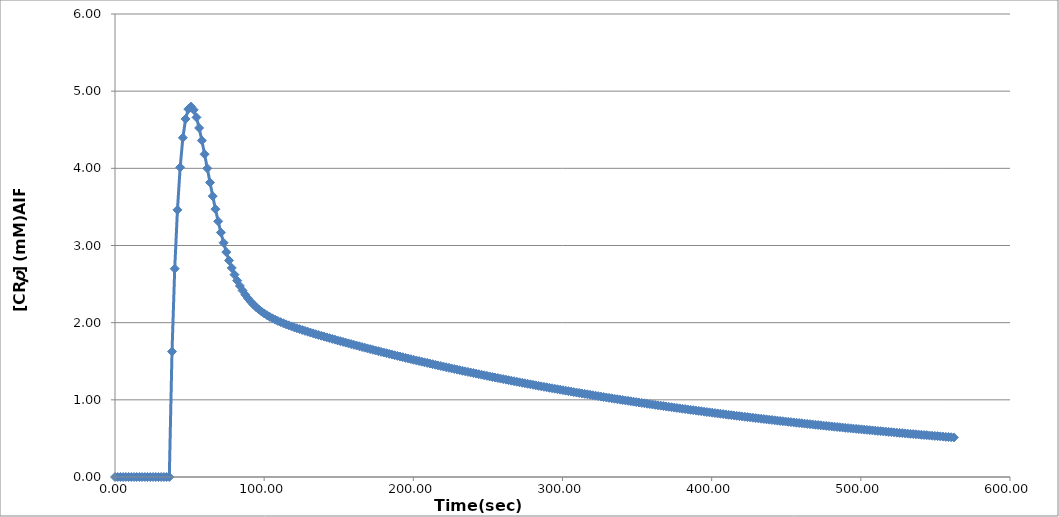
| Category | Series 0 |
|---|---|
| 0.0 | 0 |
| 1.82 | 0 |
| 3.64 | 0 |
| 5.46 | 0 |
| 7.28 | 0 |
| 9.1 | 0 |
| 10.92 | 0 |
| 12.74 | 0 |
| 14.56 | 0 |
| 16.38 | 0 |
| 18.2 | 0 |
| 20.02 | 0 |
| 21.84 | 0 |
| 23.66 | 0 |
| 25.48 | 0 |
| 27.3 | 0 |
| 29.12 | 0 |
| 30.94 | 0 |
| 32.76 | 0 |
| 34.58 | 0 |
| 36.4 | 0 |
| 38.22 | 1.625 |
| 40.04 | 2.699 |
| 41.86 | 3.462 |
| 43.68 | 4.013 |
| 45.5 | 4.396 |
| 47.32 | 4.64 |
| 49.14 | 4.768 |
| 50.96 | 4.8 |
| 52.78 | 4.758 |
| 54.6 | 4.66 |
| 56.42 | 4.523 |
| 58.24 | 4.36 |
| 60.06 | 4.183 |
| 61.88 | 3.999 |
| 63.7 | 3.817 |
| 65.52 | 3.64 |
| 67.34 | 3.471 |
| 69.16 | 3.314 |
| 70.98 | 3.168 |
| 72.8 | 3.035 |
| 74.62 | 2.915 |
| 76.44 | 2.806 |
| 78.26 | 2.709 |
| 80.08 | 2.622 |
| 81.9 | 2.545 |
| 83.72 | 2.476 |
| 85.54 | 2.416 |
| 87.36 | 2.362 |
| 89.18 | 2.314 |
| 91.0 | 2.272 |
| 92.82 | 2.234 |
| 94.64 | 2.2 |
| 96.46 | 2.17 |
| 98.28 | 2.143 |
| 100.1 | 2.118 |
| 101.92 | 2.096 |
| 103.74 | 2.075 |
| 105.56 | 2.056 |
| 107.38 | 2.039 |
| 109.2 | 2.022 |
| 111.02 | 2.007 |
| 112.84 | 1.992 |
| 114.66 | 1.978 |
| 116.48 | 1.965 |
| 118.3 | 1.952 |
| 120.12 | 1.94 |
| 121.94 | 1.928 |
| 123.76 | 1.916 |
| 125.58 | 1.905 |
| 127.4 | 1.894 |
| 129.22 | 1.883 |
| 131.04 | 1.872 |
| 132.86 | 1.861 |
| 134.68 | 1.851 |
| 136.5 | 1.84 |
| 138.32 | 1.83 |
| 140.14 | 1.82 |
| 141.96 | 1.81 |
| 143.78 | 1.8 |
| 145.6 | 1.79 |
| 147.42 | 1.78 |
| 149.24 | 1.77 |
| 151.06 | 1.761 |
| 152.88 | 1.751 |
| 154.7 | 1.741 |
| 156.52 | 1.732 |
| 158.34 | 1.722 |
| 160.16 | 1.713 |
| 161.98 | 1.704 |
| 163.8 | 1.694 |
| 165.62 | 1.685 |
| 167.44 | 1.676 |
| 169.26 | 1.667 |
| 171.08 | 1.658 |
| 172.9 | 1.649 |
| 174.72 | 1.64 |
| 176.54 | 1.631 |
| 178.36 | 1.622 |
| 180.18 | 1.613 |
| 182.0 | 1.604 |
| 183.82 | 1.595 |
| 185.64 | 1.587 |
| 187.46 | 1.578 |
| 189.28 | 1.57 |
| 191.1 | 1.561 |
| 192.92 | 1.553 |
| 194.74 | 1.544 |
| 196.56 | 1.536 |
| 198.38 | 1.527 |
| 200.2 | 1.519 |
| 202.02 | 1.511 |
| 203.84 | 1.502 |
| 205.66 | 1.494 |
| 207.48 | 1.486 |
| 209.3 | 1.478 |
| 211.12 | 1.47 |
| 212.94 | 1.462 |
| 214.76 | 1.454 |
| 216.58 | 1.446 |
| 218.4 | 1.438 |
| 220.22 | 1.43 |
| 222.04 | 1.423 |
| 223.86 | 1.415 |
| 225.68 | 1.407 |
| 227.5 | 1.4 |
| 229.32 | 1.392 |
| 231.14 | 1.384 |
| 232.96 | 1.377 |
| 234.78 | 1.369 |
| 236.6 | 1.362 |
| 238.42 | 1.354 |
| 240.24 | 1.347 |
| 242.06 | 1.34 |
| 243.88 | 1.332 |
| 245.7 | 1.325 |
| 247.52 | 1.318 |
| 249.34 | 1.311 |
| 251.16 | 1.304 |
| 252.98 | 1.297 |
| 254.8 | 1.289 |
| 256.62 | 1.282 |
| 258.44 | 1.275 |
| 260.26 | 1.269 |
| 262.08 | 1.262 |
| 263.9 | 1.255 |
| 265.72 | 1.248 |
| 267.54 | 1.241 |
| 269.36 | 1.234 |
| 271.18 | 1.228 |
| 273.0 | 1.221 |
| 274.82 | 1.214 |
| 276.64 | 1.208 |
| 278.46 | 1.201 |
| 280.28 | 1.195 |
| 282.1 | 1.188 |
| 283.92 | 1.182 |
| 285.74 | 1.175 |
| 287.56 | 1.169 |
| 289.38 | 1.162 |
| 291.2 | 1.156 |
| 293.02 | 1.15 |
| 294.84 | 1.144 |
| 296.66 | 1.137 |
| 298.48 | 1.131 |
| 300.3 | 1.125 |
| 302.12 | 1.119 |
| 303.94 | 1.113 |
| 305.76 | 1.107 |
| 307.58 | 1.101 |
| 309.4 | 1.095 |
| 311.22 | 1.089 |
| 313.04 | 1.083 |
| 314.86 | 1.077 |
| 316.68 | 1.071 |
| 318.5 | 1.065 |
| 320.32 | 1.059 |
| 322.14 | 1.054 |
| 323.96 | 1.048 |
| 325.78 | 1.042 |
| 327.6 | 1.036 |
| 329.42 | 1.031 |
| 331.24 | 1.025 |
| 333.06 | 1.02 |
| 334.88 | 1.014 |
| 336.7 | 1.009 |
| 338.52 | 1.003 |
| 340.34 | 0.998 |
| 342.16 | 0.992 |
| 343.98 | 0.987 |
| 345.8 | 0.981 |
| 347.62 | 0.976 |
| 349.44 | 0.971 |
| 351.26 | 0.965 |
| 353.08 | 0.96 |
| 354.9 | 0.955 |
| 356.72 | 0.95 |
| 358.54 | 0.945 |
| 360.36 | 0.939 |
| 362.18 | 0.934 |
| 364.0 | 0.929 |
| 365.82 | 0.924 |
| 367.64 | 0.919 |
| 369.46 | 0.914 |
| 371.28 | 0.909 |
| 373.1 | 0.904 |
| 374.92 | 0.899 |
| 376.74 | 0.894 |
| 378.56 | 0.89 |
| 380.38 | 0.885 |
| 382.2 | 0.88 |
| 384.02 | 0.875 |
| 385.84 | 0.87 |
| 387.66 | 0.866 |
| 389.48 | 0.861 |
| 391.3 | 0.856 |
| 393.12 | 0.852 |
| 394.94 | 0.847 |
| 396.76 | 0.842 |
| 398.58 | 0.838 |
| 400.4 | 0.833 |
| 402.22 | 0.829 |
| 404.04 | 0.824 |
| 405.86 | 0.82 |
| 407.68 | 0.815 |
| 409.5 | 0.811 |
| 411.32 | 0.806 |
| 413.14 | 0.802 |
| 414.96 | 0.798 |
| 416.78 | 0.793 |
| 418.6 | 0.789 |
| 420.42 | 0.785 |
| 422.24 | 0.78 |
| 424.06 | 0.776 |
| 425.88 | 0.772 |
| 427.7 | 0.768 |
| 429.52 | 0.763 |
| 431.34 | 0.759 |
| 433.16 | 0.755 |
| 434.98 | 0.751 |
| 436.8 | 0.747 |
| 438.62 | 0.743 |
| 440.44 | 0.739 |
| 442.26 | 0.735 |
| 444.08 | 0.731 |
| 445.9 | 0.727 |
| 447.72 | 0.723 |
| 449.54 | 0.719 |
| 451.36 | 0.715 |
| 453.18 | 0.711 |
| 455.0 | 0.707 |
| 456.82 | 0.703 |
| 458.64 | 0.7 |
| 460.46 | 0.696 |
| 462.28 | 0.692 |
| 464.1 | 0.688 |
| 465.92 | 0.684 |
| 467.74 | 0.681 |
| 469.56 | 0.677 |
| 471.38 | 0.673 |
| 473.2 | 0.67 |
| 475.02 | 0.666 |
| 476.84 | 0.662 |
| 478.66 | 0.659 |
| 480.48 | 0.655 |
| 482.3 | 0.652 |
| 484.12 | 0.648 |
| 485.94 | 0.645 |
| 487.76 | 0.641 |
| 489.58 | 0.638 |
| 491.4 | 0.634 |
| 493.22 | 0.631 |
| 495.04 | 0.627 |
| 496.86 | 0.624 |
| 498.68 | 0.62 |
| 500.5 | 0.617 |
| 502.32 | 0.614 |
| 504.14 | 0.61 |
| 505.96 | 0.607 |
| 507.78 | 0.604 |
| 509.6 | 0.6 |
| 511.42 | 0.597 |
| 513.24 | 0.594 |
| 515.06 | 0.591 |
| 516.88 | 0.587 |
| 518.7 | 0.584 |
| 520.52 | 0.581 |
| 522.34 | 0.578 |
| 524.16 | 0.575 |
| 525.98 | 0.572 |
| 527.8 | 0.568 |
| 529.62 | 0.565 |
| 531.44 | 0.562 |
| 533.26 | 0.559 |
| 535.08 | 0.556 |
| 536.9 | 0.553 |
| 538.72 | 0.55 |
| 540.54 | 0.547 |
| 542.36 | 0.544 |
| 544.18 | 0.541 |
| 546.0 | 0.538 |
| 547.82 | 0.535 |
| 549.64 | 0.532 |
| 551.46 | 0.53 |
| 553.28 | 0.527 |
| 555.1 | 0.524 |
| 556.92 | 0.521 |
| 558.74 | 0.518 |
| 560.56 | 0.515 |
| 562.38 | 0.512 |